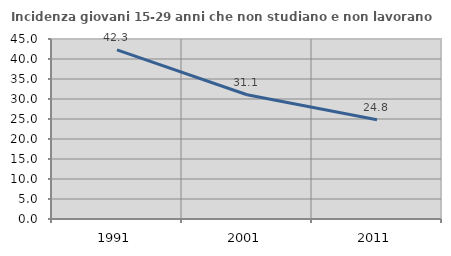
| Category | Incidenza giovani 15-29 anni che non studiano e non lavorano  |
|---|---|
| 1991.0 | 42.298 |
| 2001.0 | 31.066 |
| 2011.0 | 24.83 |